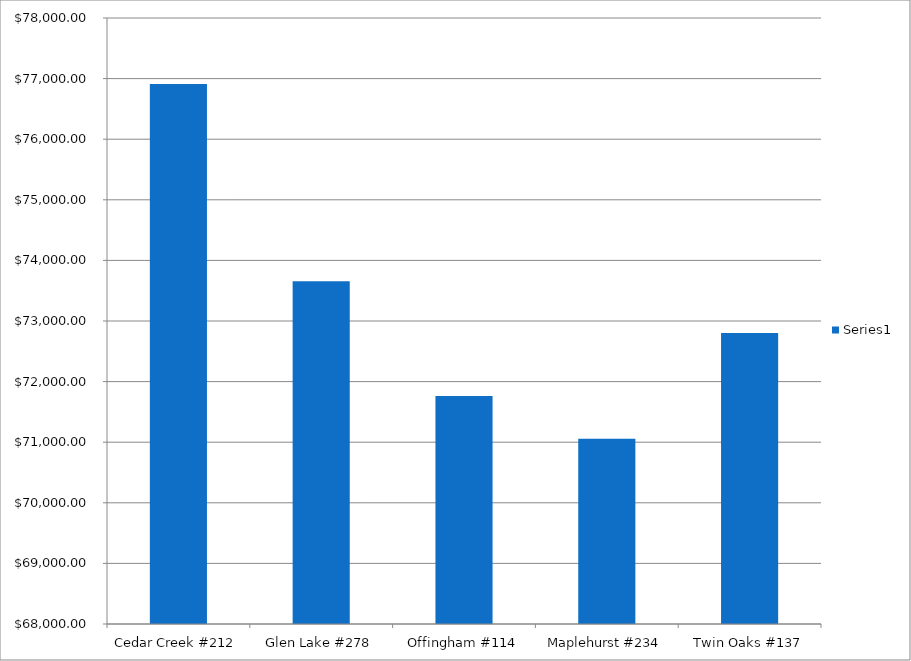
| Category | Series 0 |
|---|---|
| Cedar Creek #212 | 76909 |
| Glen Lake #278 | 73658 |
| Offingham #114 | 71762 |
| Maplehurst #234 | 71057 |
| Twin Oaks #137 | 72804 |